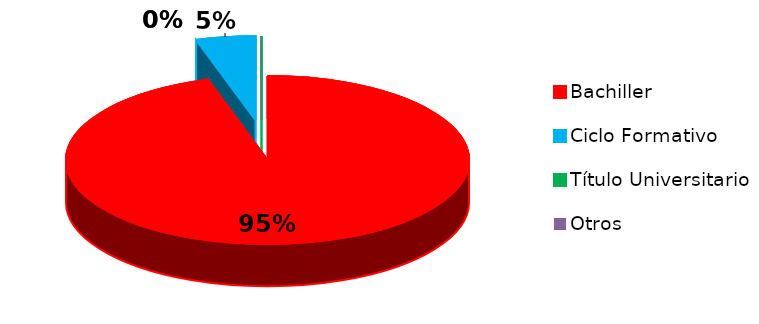
| Category | Series 0 |
|---|---|
| Bachiller | 20 |
| Ciclo Formativo | 1 |
| Título Universitario | 0 |
| Otros | 0 |